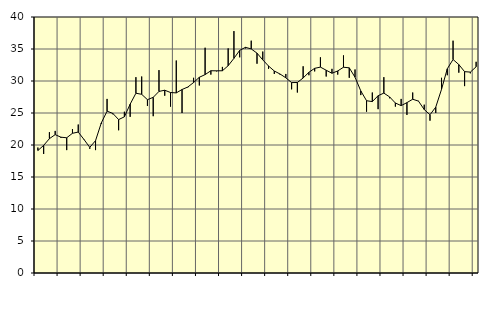
| Category | Piggar | Series 1 |
|---|---|---|
| nan | 19.6 | 19.14 |
| 1.0 | 18.6 | 19.94 |
| 1.0 | 22 | 20.99 |
| 1.0 | 22.2 | 21.62 |
| nan | 21.1 | 21.22 |
| 2.0 | 19.2 | 21.13 |
| 2.0 | 22.5 | 21.83 |
| 2.0 | 23.2 | 22.02 |
| nan | 20.8 | 20.86 |
| 3.0 | 19.4 | 19.63 |
| 3.0 | 19.2 | 20.68 |
| 3.0 | 23.3 | 23.45 |
| nan | 27.2 | 25.29 |
| 4.0 | 24.8 | 24.93 |
| 4.0 | 22.3 | 23.97 |
| 4.0 | 25.2 | 24.4 |
| nan | 24.4 | 26.38 |
| 5.0 | 30.6 | 28.09 |
| 5.0 | 30.7 | 27.92 |
| 5.0 | 26.1 | 27.08 |
| nan | 24.5 | 27.45 |
| 6.0 | 31.7 | 28.37 |
| 6.0 | 27.7 | 28.56 |
| 6.0 | 26 | 28.2 |
| nan | 33.2 | 28.14 |
| 7.0 | 25 | 28.67 |
| 7.0 | 29 | 29.06 |
| 7.0 | 30.5 | 29.76 |
| nan | 29.3 | 30.58 |
| 8.0 | 35.2 | 31 |
| 8.0 | 31 | 31.6 |
| 8.0 | 31.5 | 31.59 |
| nan | 32.2 | 31.6 |
| 9.0 | 35.1 | 32.39 |
| 9.0 | 37.8 | 33.54 |
| 9.0 | 33.7 | 34.79 |
| nan | 35.1 | 35.26 |
| 10.0 | 36.3 | 35.01 |
| 10.0 | 32.7 | 34.35 |
| 10.0 | 34.6 | 33.3 |
| nan | 31.9 | 32.34 |
| 11.0 | 31.1 | 31.56 |
| 11.0 | 31 | 31.09 |
| 11.0 | 31.1 | 30.5 |
| nan | 28.7 | 29.75 |
| 12.0 | 28.2 | 29.77 |
| 12.0 | 32.3 | 30.47 |
| 12.0 | 30.9 | 31.36 |
| nan | 31.5 | 31.98 |
| 13.0 | 33.7 | 32.17 |
| 13.0 | 30.7 | 31.68 |
| 13.0 | 31.9 | 31.21 |
| nan | 31 | 31.57 |
| 14.0 | 34 | 32.15 |
| 14.0 | 30.5 | 32.06 |
| 14.0 | 31.8 | 30.59 |
| nan | 27.8 | 28.45 |
| 15.0 | 25.2 | 26.92 |
| 15.0 | 28.2 | 26.78 |
| 15.0 | 25.6 | 27.7 |
| nan | 30.6 | 28.11 |
| 16.0 | 27.3 | 27.51 |
| 16.0 | 26 | 26.56 |
| 16.0 | 27.2 | 26.15 |
| nan | 24.7 | 26.62 |
| 17.0 | 28.2 | 27.15 |
| 17.0 | 26.9 | 26.86 |
| 17.0 | 26.3 | 25.54 |
| nan | 23.8 | 24.73 |
| 18.0 | 25 | 25.92 |
| 18.0 | 30.5 | 28.7 |
| 18.0 | 30.9 | 31.91 |
| nan | 36.3 | 33.36 |
| 19.0 | 31.3 | 32.57 |
| 19.0 | 29.2 | 31.46 |
| 19.0 | 31.2 | 31.39 |
| nan | 33 | 32.22 |